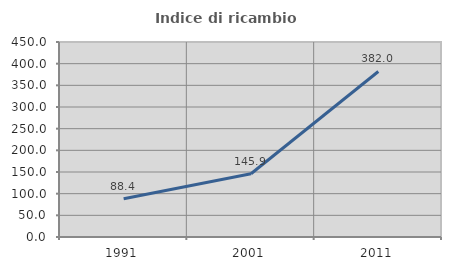
| Category | Indice di ricambio occupazionale  |
|---|---|
| 1991.0 | 88.353 |
| 2001.0 | 145.946 |
| 2011.0 | 382.022 |